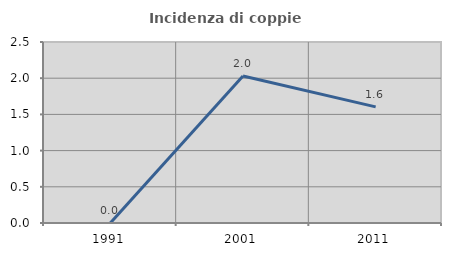
| Category | Incidenza di coppie miste |
|---|---|
| 1991.0 | 0 |
| 2001.0 | 2.03 |
| 2011.0 | 1.604 |